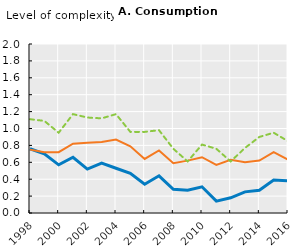
| Category | Africa | Asia | LAC |
|---|---|---|---|
| 1998.0 | 0.76 | 0.75 | 1.11 |
| 1999.0 | 0.7 | 0.72 | 1.09 |
| 2000.0 | 0.57 | 0.72 | 0.95 |
| 2001.0 | 0.66 | 0.82 | 1.17 |
| 2002.0 | 0.52 | 0.83 | 1.13 |
| 2003.0 | 0.59 | 0.84 | 1.12 |
| 2004.0 | 0.53 | 0.87 | 1.17 |
| 2005.0 | 0.47 | 0.79 | 0.96 |
| 2006.0 | 0.34 | 0.64 | 0.96 |
| 2007.0 | 0.44 | 0.74 | 0.98 |
| 2008.0 | 0.28 | 0.59 | 0.76 |
| 2009.0 | 0.27 | 0.62 | 0.61 |
| 2010.0 | 0.31 | 0.66 | 0.81 |
| 2011.0 | 0.14 | 0.57 | 0.76 |
| 2012.0 | 0.18 | 0.63 | 0.61 |
| 2013.0 | 0.25 | 0.6 | 0.77 |
| 2014.0 | 0.27 | 0.62 | 0.9 |
| 2015.0 | 0.39 | 0.72 | 0.95 |
| 2016.0 | 0.38 | 0.63 | 0.85 |